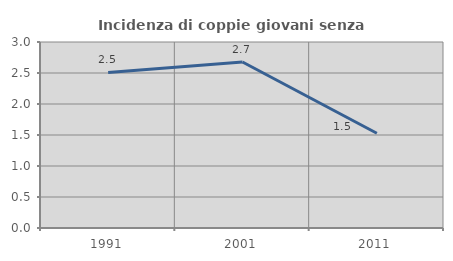
| Category | Incidenza di coppie giovani senza figli |
|---|---|
| 1991.0 | 2.51 |
| 2001.0 | 2.678 |
| 2011.0 | 1.528 |